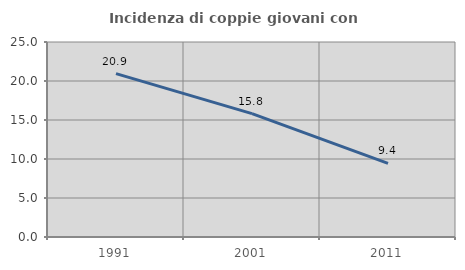
| Category | Incidenza di coppie giovani con figli |
|---|---|
| 1991.0 | 20.938 |
| 2001.0 | 15.811 |
| 2011.0 | 9.436 |